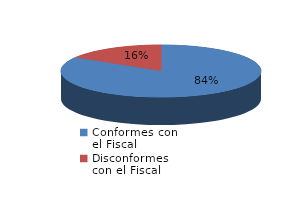
| Category | Series 0 |
|---|---|
| 0 | 283 |
| 1 | 55 |